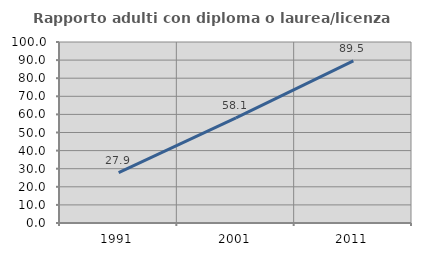
| Category | Rapporto adulti con diploma o laurea/licenza media  |
|---|---|
| 1991.0 | 27.861 |
| 2001.0 | 58.077 |
| 2011.0 | 89.531 |